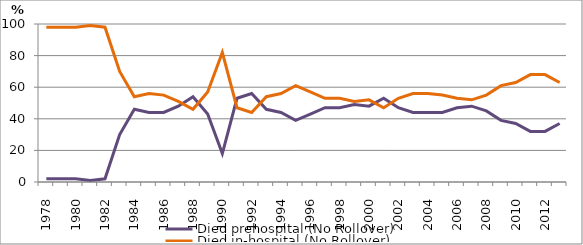
| Category | Died prehospital (No Rollover) | Died in-hospital (No Rollover) |
|---|---|---|
| 1978.0 | 2 | 98 |
| 1979.0 | 2 | 98 |
| 1980.0 | 2 | 98 |
| 1981.0 | 1 | 99 |
| 1982.0 | 2 | 98 |
| 1983.0 | 30 | 70 |
| 1984.0 | 46 | 54 |
| 1985.0 | 44 | 56 |
| 1986.0 | 44 | 55 |
| 1987.0 | 48 | 51 |
| 1988.0 | 54 | 46 |
| 1989.0 | 43 | 57 |
| 1990.0 | 18 | 82 |
| 1991.0 | 53 | 47 |
| 1992.0 | 56 | 44 |
| 1993.0 | 46 | 54 |
| 1994.0 | 44 | 56 |
| 1995.0 | 39 | 61 |
| 1996.0 | 43 | 57 |
| 1997.0 | 47 | 53 |
| 1998.0 | 47 | 53 |
| 1999.0 | 49 | 51 |
| 2000.0 | 48 | 52 |
| 2001.0 | 53 | 47 |
| 2002.0 | 47 | 53 |
| 2003.0 | 44 | 56 |
| 2004.0 | 44 | 56 |
| 2005.0 | 44 | 55 |
| 2006.0 | 47 | 53 |
| 2007.0 | 48 | 52 |
| 2008.0 | 45 | 55 |
| 2009.0 | 39 | 61 |
| 2010.0 | 37 | 63 |
| 2011.0 | 32 | 68 |
| 2012.0 | 32 | 68 |
| 2013.0 | 37 | 63 |